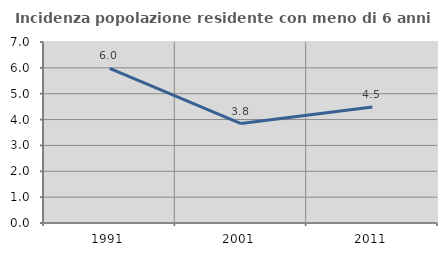
| Category | Incidenza popolazione residente con meno di 6 anni |
|---|---|
| 1991.0 | 5.98 |
| 2001.0 | 3.846 |
| 2011.0 | 4.484 |